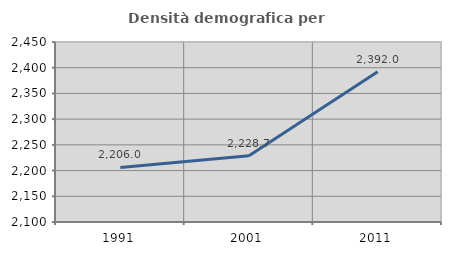
| Category | Densità demografica |
|---|---|
| 1991.0 | 2205.988 |
| 2001.0 | 2228.665 |
| 2011.0 | 2391.997 |